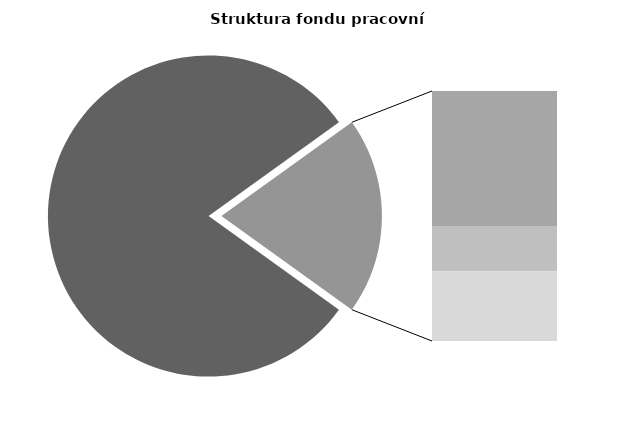
| Category | Series 0 |
|---|---|
| Průměrná měsíční odpracovaná doba bez přesčasu | 137.705 |
| Dovolená | 18.411 |
| Nemoc | 6.159 |
| Jiné | 9.499 |